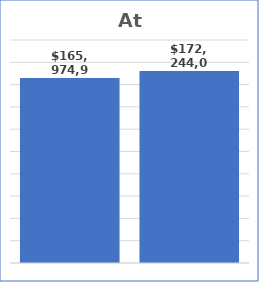
| Category | Series 0 |
|---|---|
|  | 165974912.122 |
|  | 172244063.828 |